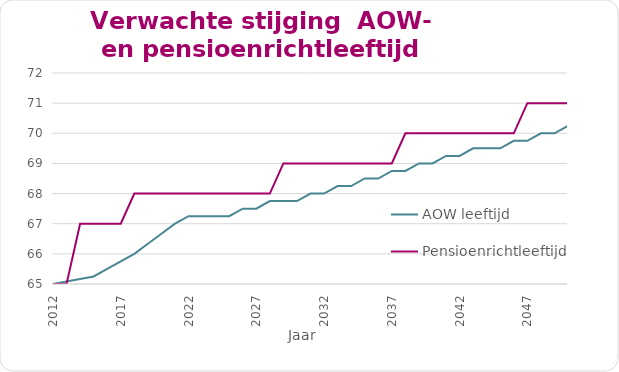
| Category | AOW leeftijd | Pensioenrichtleeftijd |
|---|---|---|
| 2012.0 | 65 | 65 |
| 2013.0 | 65.083 | 65 |
| 2014.0 | 65.167 | 67 |
| 2015.0 | 65.25 | 67 |
| 2016.0 | 65.5 | 67 |
| 2017.0 | 65.75 | 67 |
| 2018.0 | 66 | 68 |
| 2019.0 | 66.333 | 68 |
| 2020.0 | 66.667 | 68 |
| 2021.0 | 67 | 68 |
| 2022.0 | 67.25 | 68 |
| 2023.0 | 67.25 | 68 |
| 2024.0 | 67.25 | 68 |
| 2025.0 | 67.25 | 68 |
| 2026.0 | 67.5 | 68 |
| 2027.0 | 67.5 | 68 |
| 2028.0 | 67.75 | 68 |
| 2029.0 | 67.75 | 69 |
| 2030.0 | 67.75 | 69 |
| 2031.0 | 68 | 69 |
| 2032.0 | 68 | 69 |
| 2033.0 | 68.25 | 69 |
| 2034.0 | 68.25 | 69 |
| 2035.0 | 68.5 | 69 |
| 2036.0 | 68.5 | 69 |
| 2037.0 | 68.75 | 69 |
| 2038.0 | 68.75 | 70 |
| 2039.0 | 69 | 70 |
| 2040.0 | 69 | 70 |
| 2041.0 | 69.25 | 70 |
| 2042.0 | 69.25 | 70 |
| 2043.0 | 69.5 | 70 |
| 2044.0 | 69.5 | 70 |
| 2045.0 | 69.5 | 70 |
| 2046.0 | 69.75 | 70 |
| 2047.0 | 69.75 | 71 |
| 2048.0 | 70 | 71 |
| 2049.0 | 70 | 71 |
| 2050.0 | 70.25 | 71 |